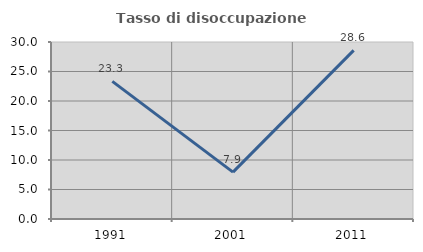
| Category | Tasso di disoccupazione giovanile  |
|---|---|
| 1991.0 | 23.333 |
| 2001.0 | 7.937 |
| 2011.0 | 28.571 |